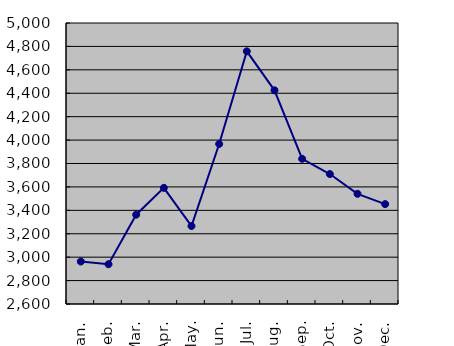
| Category | Series 0 |
|---|---|
| Jan. | 2963 |
| Feb. | 2940 |
| Mar. | 3363 |
| Apr. | 3592 |
| May. | 3266 |
| Jun. | 3967 |
| Jul. | 4758 |
| Aug. | 4425 |
| Sep. | 3840 |
| Oct. | 3710 |
| Nov. | 3541 |
| Dec. | 3453 |